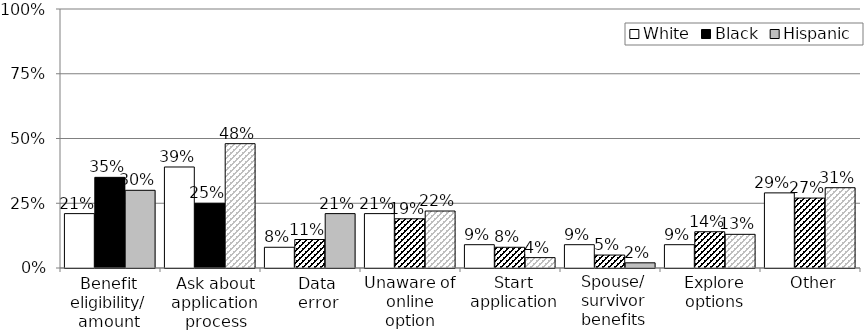
| Category | White | Black | Hispanic |
|---|---|---|---|
| Benefit eligibility/amount | 0.21 | 0.35 | 0.3 |
| Ask about app. process | 0.39 | 0.25 | 0.48 |
| Data error | 0.08 | 0.11 | 0.21 |
| Unaware of online option | 0.21 | 0.19 | 0.22 |
| Start application | 0.09 | 0.08 | 0.04 |
| Spouse/survivor benefits | 0.09 | 0.05 | 0.02 |
| Explore options | 0.09 | 0.14 | 0.13 |
| Other | 0.29 | 0.27 | 0.31 |